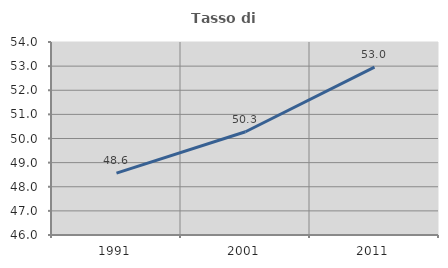
| Category | Tasso di occupazione   |
|---|---|
| 1991.0 | 48.563 |
| 2001.0 | 50.28 |
| 2011.0 | 52.956 |